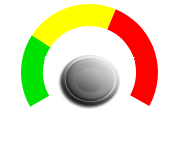
| Category | PIE |
|---|---|
| 0 | 8 |
| 1 | 0.3 |
| 2 | 14.2 |